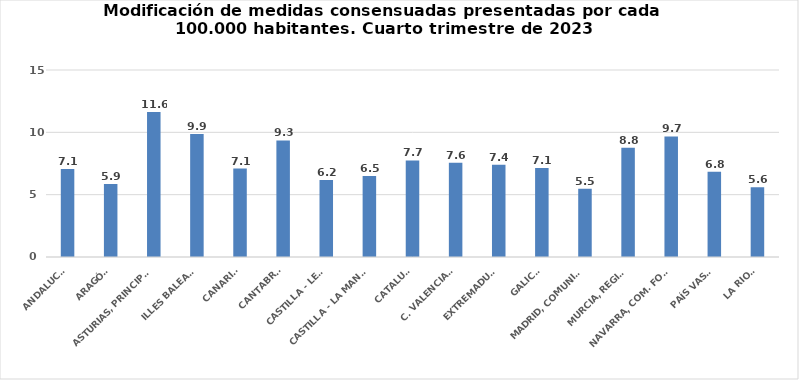
| Category | Series 0 |
|---|---|
| ANDALUCÍA | 7.067 |
| ARAGÓN | 5.855 |
| ASTURIAS, PRINCIPADO | 11.623 |
| ILLES BALEARS | 9.861 |
| CANARIAS | 7.095 |
| CANTABRIA | 9.345 |
| CASTILLA - LEÓN | 6.17 |
| CASTILLA - LA MANCHA | 6.488 |
| CATALUÑA | 7.748 |
| C. VALENCIANA | 7.57 |
| EXTREMADURA | 7.398 |
| GALICIA | 7.149 |
| MADRID, COMUNIDAD | 5.475 |
| MURCIA, REGIÓN | 8.759 |
| NAVARRA, COM. FORAL | 9.67 |
| PAÍS VASCO | 6.847 |
| LA RIOJA | 5.586 |